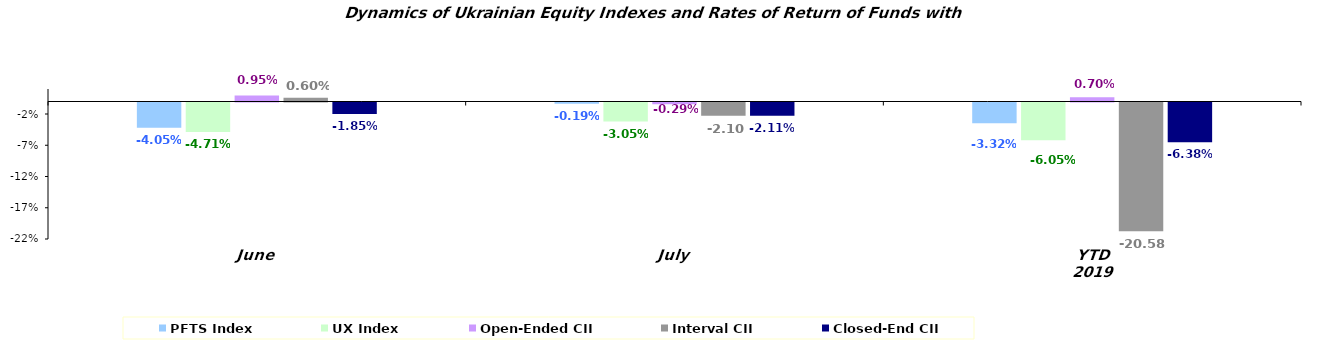
| Category | PFTS Index | UX Index | Open-Ended CII | Interval CII | Closed-End CII |
|---|---|---|---|---|---|
| June | -0.041 | -0.047 | 0.01 | 0.006 | -0.019 |
| July | -0.002 | -0.031 | -0.003 | -0.021 | -0.021 |
| YTD 2019 | -0.033 | -0.06 | 0.007 | -0.206 | -0.064 |